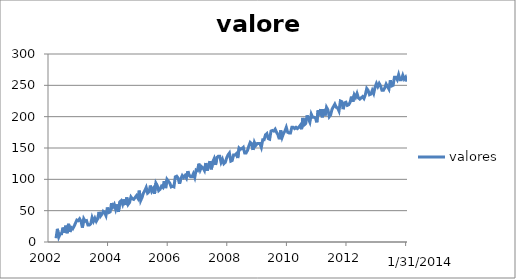
| Category | valores |
|---|---|
| 2002-04-09 | 6 |
| 2002-04-26 | 21 |
| 2002-05-13 | 8 |
| 2002-05-30 | 13 |
| 2002-06-16 | 13 |
| 2002-07-03 | 23 |
| 2002-07-20 | 15 |
| 2002-08-06 | 26 |
| 2002-08-23 | 14 |
| 2002-09-09 | 29 |
| 2002-09-26 | 16 |
| 2002-10-13 | 23 |
| 2002-10-30 | 21 |
| 2002-11-16 | 25 |
| 2002-12-03 | 30 |
| 2002-12-20 | 35 |
| 2003-01-06 | 34 |
| 2003-01-23 | 37 |
| 2003-02-09 | 33 |
| 2003-02-26 | 23 |
| 2003-03-15 | 37 |
| 2003-04-01 | 33 |
| 2003-04-18 | 34 |
| 2003-05-05 | 27 |
| 2003-05-22 | 27 |
| 2003-06-08 | 29 |
| 2003-06-25 | 39 |
| 2003-07-12 | 33 |
| 2003-07-29 | 38 |
| 2003-08-15 | 33 |
| 2003-09-01 | 37 |
| 2003-09-18 | 48 |
| 2003-10-05 | 41 |
| 2003-10-22 | 44 |
| 2003-11-08 | 49 |
| 2003-11-25 | 47 |
| 2003-12-12 | 42 |
| 2003-12-29 | 55 |
| 2004-01-15 | 47 |
| 2004-02-01 | 48 |
| 2004-02-18 | 62 |
| 2004-03-06 | 56 |
| 2004-03-23 | 60 |
| 2004-04-09 | 52 |
| 2004-04-26 | 60 |
| 2004-05-13 | 48 |
| 2004-05-30 | 64 |
| 2004-06-16 | 66 |
| 2004-07-03 | 60 |
| 2004-07-20 | 68 |
| 2004-08-06 | 59 |
| 2004-08-23 | 71 |
| 2004-09-09 | 60 |
| 2004-09-26 | 63 |
| 2004-10-13 | 72 |
| 2004-10-30 | 69 |
| 2004-11-16 | 68 |
| 2004-12-03 | 71 |
| 2004-12-20 | 74 |
| 2005-01-06 | 70 |
| 2005-01-23 | 82 |
| 2005-02-09 | 66 |
| 2005-02-26 | 71 |
| 2005-03-15 | 78 |
| 2005-04-01 | 82 |
| 2005-04-18 | 87 |
| 2005-05-05 | 78 |
| 2005-05-22 | 80 |
| 2005-06-08 | 90 |
| 2005-06-25 | 81 |
| 2005-07-12 | 85 |
| 2005-07-29 | 77 |
| 2005-08-15 | 94 |
| 2005-09-01 | 90 |
| 2005-09-18 | 82 |
| 2005-10-05 | 84 |
| 2005-10-22 | 89 |
| 2005-11-08 | 87 |
| 2005-11-25 | 97 |
| 2005-12-12 | 86 |
| 2005-12-29 | 100 |
| 2006-01-15 | 97 |
| 2006-02-01 | 94 |
| 2006-02-18 | 88 |
| 2006-03-07 | 89 |
| 2006-03-24 | 88 |
| 2006-04-10 | 104 |
| 2006-04-27 | 105 |
| 2006-05-14 | 102 |
| 2006-05-31 | 93 |
| 2006-06-17 | 101 |
| 2006-07-04 | 106 |
| 2006-07-21 | 103 |
| 2006-08-07 | 106 |
| 2006-08-24 | 102 |
| 2006-09-10 | 113 |
| 2006-09-27 | 106 |
| 2006-10-14 | 104 |
| 2006-10-31 | 104 |
| 2006-11-17 | 109 |
| 2006-12-04 | 103 |
| 2006-12-21 | 115 |
| 2007-01-07 | 114 |
| 2007-01-24 | 125 |
| 2007-02-10 | 115 |
| 2007-02-27 | 120 |
| 2007-03-16 | 118 |
| 2007-04-02 | 114 |
| 2007-04-19 | 126 |
| 2007-05-06 | 114 |
| 2007-05-23 | 122 |
| 2007-06-09 | 129 |
| 2007-06-26 | 116 |
| 2007-07-13 | 128 |
| 2007-07-30 | 133 |
| 2007-08-16 | 123 |
| 2007-09-02 | 135 |
| 2007-09-19 | 137 |
| 2007-10-06 | 137 |
| 2007-10-23 | 127 |
| 2007-11-09 | 132 |
| 2007-11-26 | 125 |
| 2007-12-13 | 127 |
| 2007-12-30 | 134 |
| 2008-01-16 | 139 |
| 2008-02-02 | 142 |
| 2008-02-19 | 129 |
| 2008-03-07 | 130 |
| 2008-03-24 | 139 |
| 2008-04-10 | 139 |
| 2008-04-27 | 141 |
| 2008-05-14 | 134 |
| 2008-05-31 | 150 |
| 2008-06-17 | 148 |
| 2008-07-04 | 149 |
| 2008-07-21 | 151 |
| 2008-08-07 | 142 |
| 2008-08-24 | 142 |
| 2008-09-10 | 146 |
| 2008-09-27 | 153 |
| 2008-10-14 | 159 |
| 2008-10-31 | 157 |
| 2008-11-17 | 147 |
| 2008-12-04 | 159 |
| 2008-12-21 | 154 |
| 2009-01-07 | 157 |
| 2009-01-24 | 157 |
| 2009-02-10 | 157 |
| 2009-02-27 | 151 |
| 2009-03-16 | 163 |
| 2009-04-02 | 163 |
| 2009-04-19 | 171 |
| 2009-05-06 | 173 |
| 2009-05-23 | 165 |
| 2009-06-09 | 164 |
| 2009-06-26 | 177 |
| 2009-07-13 | 178 |
| 2009-07-30 | 177 |
| 2009-08-16 | 180 |
| 2009-09-02 | 175 |
| 2009-09-19 | 171 |
| 2009-10-06 | 164 |
| 2009-10-23 | 178 |
| 2009-11-09 | 167 |
| 2009-11-26 | 173 |
| 2009-12-13 | 177 |
| 2009-12-30 | 183 |
| 2010-01-16 | 175 |
| 2010-02-02 | 174 |
| 2010-02-19 | 174 |
| 2010-03-08 | 183 |
| 2010-03-25 | 183 |
| 2010-04-11 | 181 |
| 2010-04-28 | 183 |
| 2010-05-15 | 181 |
| 2010-06-01 | 183 |
| 2010-06-18 | 186 |
| 2010-07-05 | 180 |
| 2010-07-22 | 198 |
| 2010-08-08 | 187 |
| 2010-08-25 | 189 |
| 2010-09-11 | 202 |
| 2010-09-28 | 196 |
| 2010-10-15 | 191 |
| 2010-11-01 | 204 |
| 2010-11-18 | 199 |
| 2010-12-05 | 199 |
| 2010-12-22 | 198 |
| 2011-01-08 | 191 |
| 2011-01-25 | 210 |
| 2011-02-11 | 202 |
| 2011-02-28 | 212 |
| 2011-03-17 | 199 |
| 2011-04-03 | 212 |
| 2011-04-20 | 202 |
| 2011-05-07 | 215 |
| 2011-05-24 | 211 |
| 2011-06-10 | 200 |
| 2011-06-27 | 203 |
| 2011-07-14 | 212 |
| 2011-07-31 | 216 |
| 2011-08-17 | 220 |
| 2011-09-03 | 215 |
| 2011-09-20 | 214 |
| 2011-10-07 | 209 |
| 2011-10-24 | 225 |
| 2011-11-10 | 224 |
| 2011-11-27 | 212 |
| 2011-12-14 | 222 |
| 2011-12-31 | 223 |
| 2012-01-17 | 218 |
| 2012-02-03 | 219 |
| 2012-02-20 | 223 |
| 2012-03-08 | 232 |
| 2012-03-25 | 224 |
| 2012-04-11 | 235 |
| 2012-04-28 | 231 |
| 2012-05-15 | 237 |
| 2012-06-01 | 230 |
| 2012-06-18 | 228 |
| 2012-07-05 | 230 |
| 2012-07-22 | 232 |
| 2012-08-08 | 229 |
| 2012-08-25 | 235 |
| 2012-09-11 | 245 |
| 2012-09-28 | 242 |
| 2012-10-15 | 235 |
| 2012-11-01 | 236 |
| 2012-11-18 | 242 |
| 2012-12-05 | 237 |
| 2012-12-22 | 247 |
| 2013-01-08 | 253 |
| 2013-01-25 | 248 |
| 2013-02-11 | 253 |
| 2013-02-28 | 249 |
| 2013-03-17 | 242 |
| 2013-04-03 | 242 |
| 2013-04-20 | 246 |
| 2013-05-07 | 252 |
| 2013-05-24 | 248 |
| 2013-06-10 | 244 |
| 2013-06-27 | 258 |
| 2013-07-14 | 249 |
| 2013-07-31 | 250 |
| 2013-08-17 | 263 |
| 2013-09-03 | 263 |
| 2013-09-20 | 259 |
| 2013-10-07 | 267 |
| 2013-10-24 | 259 |
| 2013-11-10 | 259 |
| 2013-11-27 | 266 |
| 2013-12-14 | 260 |
| 2013-12-31 | 263 |
| 2014-01-17 | 256 |